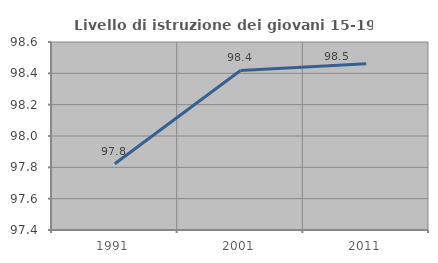
| Category | Livello di istruzione dei giovani 15-19 anni |
|---|---|
| 1991.0 | 97.823 |
| 2001.0 | 98.418 |
| 2011.0 | 98.462 |